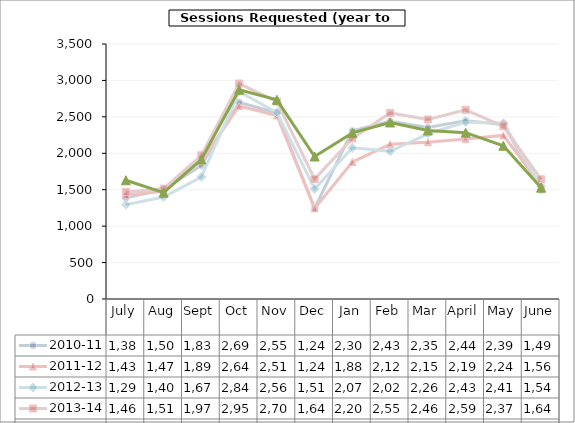
| Category | 2010-11 | 2011-12 | 2012-13 | 2013-14 | 2014-15 |
|---|---|---|---|---|---|
| July | 1388 | 1430 | 1295 | 1469 | 1630 |
| Aug | 1502 | 1479 | 1400 | 1514 | 1460 |
| Sept | 1832 | 1897 | 1675 | 1973 | 1916 |
| Oct | 2699 | 2649 | 2846 | 2957 | 2873 |
| Nov | 2553 | 2519 | 2560 | 2709 | 2734 |
| Dec | 1246 | 1244 | 1511 | 1646 | 1956 |
| Jan | 2308 | 1880 | 2075 | 2204 | 2280 |
| Feb | 2439 | 2124 | 2027 | 2554 | 2423 |
| Mar | 2354 | 2152 | 2267 | 2464 | 2313 |
| April | 2448 | 2197 | 2430 | 2597 | 2283 |
| May | 2396 | 2245 | 2414 | 2371 | 2103 |
| June | 1498 | 1561 | 1548 | 1643 | 1528 |